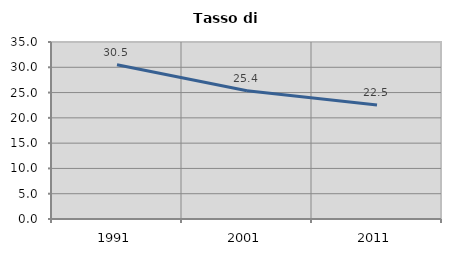
| Category | Tasso di disoccupazione   |
|---|---|
| 1991.0 | 30.511 |
| 2001.0 | 25.365 |
| 2011.0 | 22.539 |